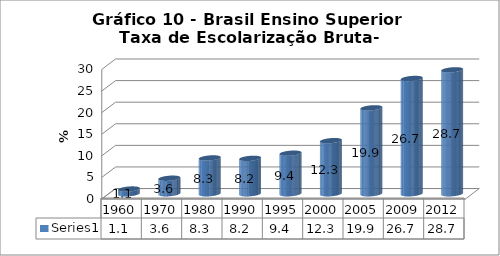
| Category | Series 0 |
|---|---|
| 1960.0 | 1.1 |
| 1970.0 | 3.6 |
| 1980.0 | 8.3 |
| 1990.0 | 8.2 |
| 1995.0 | 9.4 |
| 2000.0 | 12.3 |
| 2005.0 | 19.9 |
| 2009.0 | 26.7 |
| 2012.0 | 28.7 |